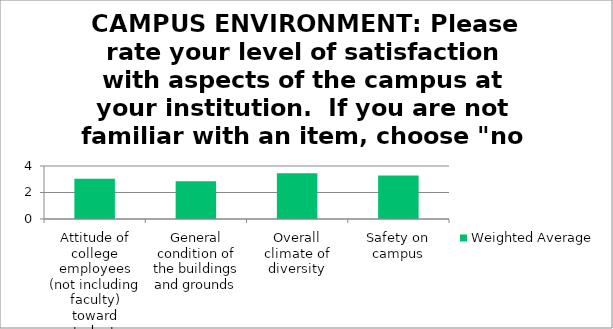
| Category | Weighted Average |
|---|---|
| Attitude of college employees (not including faculty) toward students | 3.04 |
| General condition of the buildings and grounds | 2.84 |
| Overall climate of diversity | 3.46 |
| Safety on campus | 3.28 |